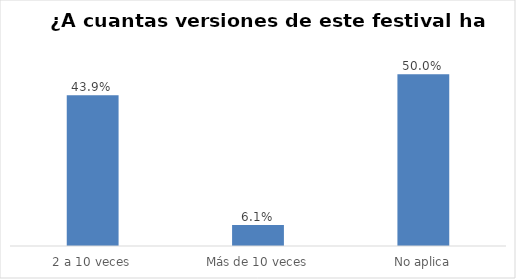
| Category | Series 0 |
|---|---|
| 2 a 10 veces | 0.439 |
| Más de 10 veces | 0.061 |
| No aplica | 0.5 |